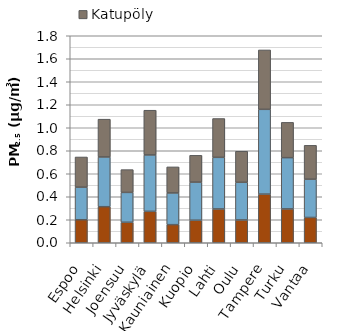
| Category | Työkoneiden pakokaasuperäiset hiukkaset | Pakokaasuperäiset hiukkaset | Katupöly |
|---|---|---|---|
| Espoo | 0.2 | 0.283 | 0.262 |
| Helsinki | 0.313 | 0.433 | 0.329 |
| Joensuu | 0.178 | 0.26 | 0.198 |
| Jyväskylä | 0.273 | 0.491 | 0.389 |
| Kauniainen | 0.157 | 0.276 | 0.226 |
| Kuopio | 0.196 | 0.331 | 0.233 |
| Lahti | 0.294 | 0.449 | 0.338 |
| Oulu | 0.198 | 0.328 | 0.27 |
| Tampere | 0.423 | 0.737 | 0.516 |
| Turku | 0.295 | 0.445 | 0.307 |
| Vantaa | 0.22 | 0.333 | 0.294 |